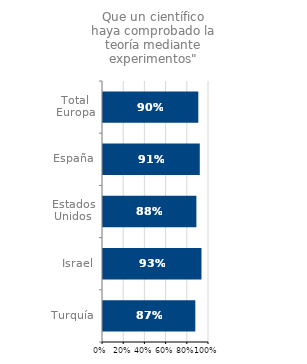
| Category | Que un científico haya comprobado la teoría mediante experimentos |
|---|---|
| Turquía | 0.871 |
| Israel | 0.929 |
| Estados Unidos | 0.881 |
| España | 0.913 |
| Total Europa | 0.899 |